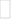
| Category | Series 0 |
|---|---|
| 300.0 | -1 |
| 600.0 | 1 |
| 900.0 | 3 |
| 1200.0 | 5 |
| 1500.0 | 6 |